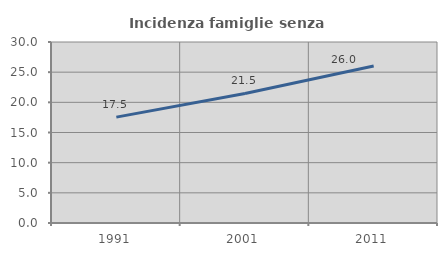
| Category | Incidenza famiglie senza nuclei |
|---|---|
| 1991.0 | 17.55 |
| 2001.0 | 21.476 |
| 2011.0 | 26.012 |